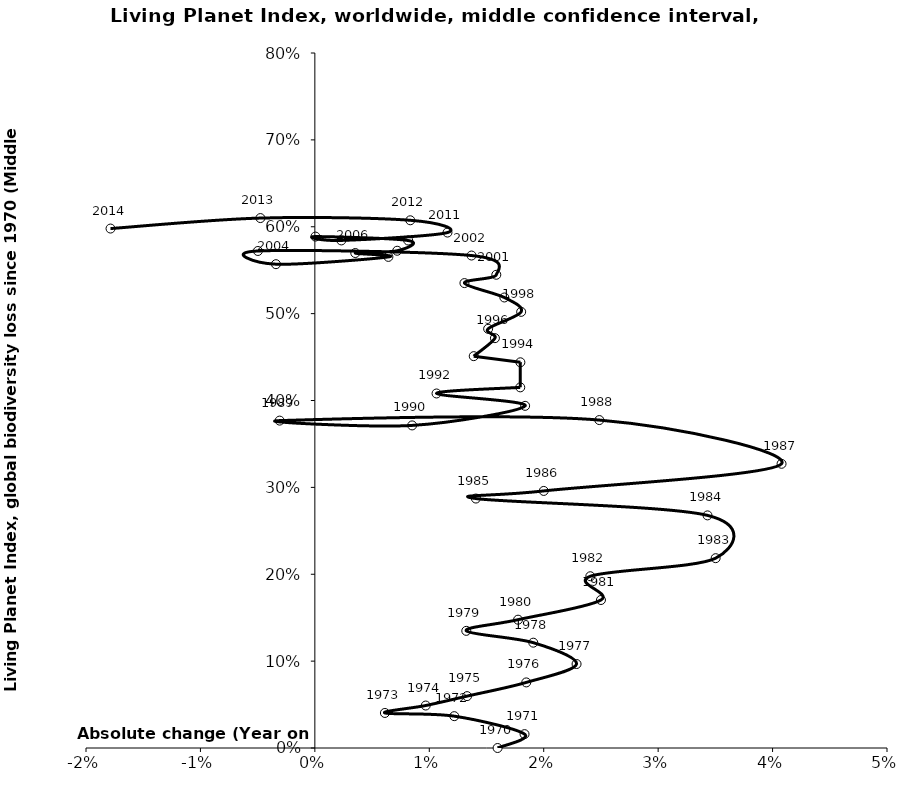
| Category | Series 0 |
|---|---|
| 0.015970066592783994 | 0 |
| 0.018324653691040527 | 0.016 |
| 0.012183060801901513 | 0.037 |
| 0.006120496160125 | 0.04 |
| 0.009689338799621972 | 0.049 |
| 0.013302375148488976 | 0.06 |
| 0.0184749692391295 | 0.075 |
| 0.022871112421967987 | 0.097 |
| 0.019087859065573032 | 0.121 |
| 0.013232534418006037 | 0.135 |
| 0.017758139303349962 | 0.148 |
| 0.02500339257147599 | 0.17 |
| 0.024072551861053004 | 0.198 |
| 0.035026420265516 | 0.219 |
| 0.03431370823073604 | 0.268 |
| 0.014074010577856455 | 0.287 |
| 0.020001967878589988 | 0.296 |
| 0.04078507928583153 | 0.327 |
| 0.02486092669782597 | 0.377 |
| -0.0030769784033125025 | 0.377 |
| 0.008499679817401518 | 0.371 |
| 0.01837512932010299 | 0.394 |
| 0.01063342405336648 | 0.408 |
| 0.017950478542249015 | 0.415 |
| 0.017961223973324503 | 0.444 |
| 0.013884394241219011 | 0.451 |
| 0.015736579021948527 | 0.472 |
| 0.015143082099992489 | 0.483 |
| 0.018029681530751518 | 0.502 |
| 0.016559203571237524 | 0.519 |
| 0.013072646306911517 | 0.535 |
| 0.015857238131877005 | 0.545 |
| 0.01369224219630849 | 0.567 |
| -0.004976880180441068 | 0.572 |
| -0.0033983300168325403 | 0.557 |
| 0.006426230115379572 | 0.565 |
| 0.003531828954748517 | 0.57 |
| 0.007195849406057442 | 0.572 |
| 0.008157396715112453 | 0.584 |
| 5.0295230848984573e-05 | 0.589 |
| 0.002313315045672004 | 0.584 |
| 0.011590232968071046 | 0.593 |
| 0.008339160899520526 | 0.607 |
| -0.004758819067929521 | 0.61 |
| -0.017856799035379567 | 0.598 |